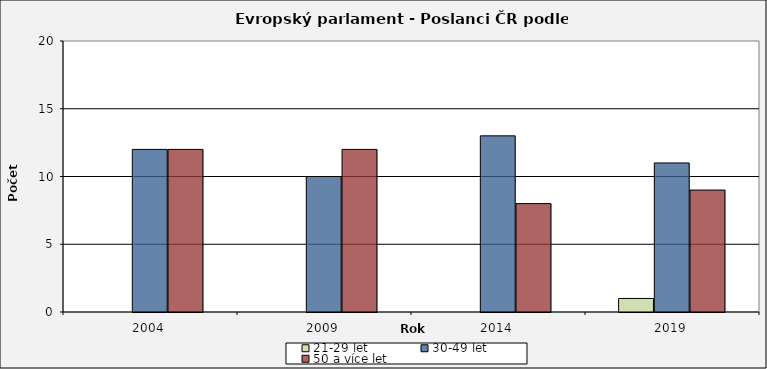
| Category | 21-29 let | 30-49 let | 50 a více let |
|---|---|---|---|
| 2004.0 | 0 | 12 | 12 |
| 2009.0 | 0 | 10 | 12 |
| 2014.0 | 0 | 13 | 8 |
| 2019.0 | 1 | 11 | 9 |